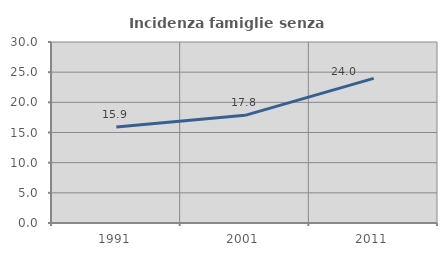
| Category | Incidenza famiglie senza nuclei |
|---|---|
| 1991.0 | 15.921 |
| 2001.0 | 17.84 |
| 2011.0 | 23.976 |